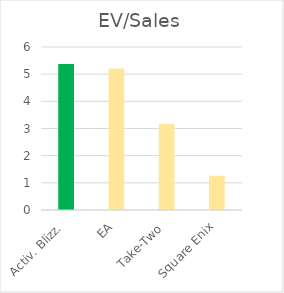
| Category | EV/Sales |
|---|---|
| Activ. Blizz. | 5.37 |
| EA | 5.21 |
| Take-Two | 3.17 |
| Square Enix | 1.26 |